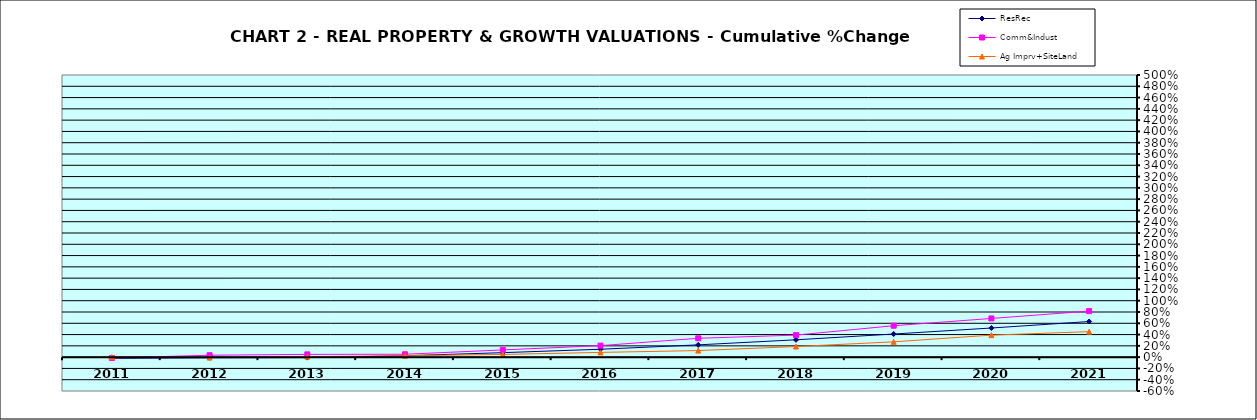
| Category | ResRec | Comm&Indust | Ag Imprv+SiteLand |
|---|---|---|---|
| 2011.0 | -0.021 | -0.016 | 0 |
| 2012.0 | -0.012 | 0.034 | -0.007 |
| 2013.0 | -0.009 | 0.049 | 0.009 |
| 2014.0 | 0.025 | 0.051 | 0.025 |
| 2015.0 | 0.079 | 0.128 | 0.048 |
| 2016.0 | 0.14 | 0.204 | 0.084 |
| 2017.0 | 0.218 | 0.334 | 0.117 |
| 2018.0 | 0.307 | 0.391 | 0.188 |
| 2019.0 | 0.41 | 0.557 | 0.271 |
| 2020.0 | 0.516 | 0.686 | 0.39 |
| 2021.0 | 0.631 | 0.816 | 0.451 |